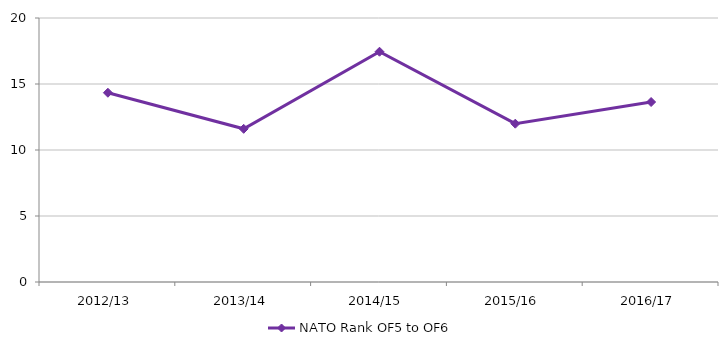
| Category | NATO Rank OF5 to OF6 |
|---|---|
| 2012/13 | 14.337 |
| 2013/14 | 11.605 |
| 2014/15 | 17.444 |
| 2015/16 | 11.993 |
| 2016/17 | 13.635 |